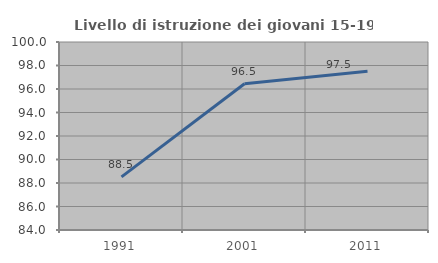
| Category | Livello di istruzione dei giovani 15-19 anni |
|---|---|
| 1991.0 | 88.523 |
| 2001.0 | 96.451 |
| 2011.0 | 97.517 |